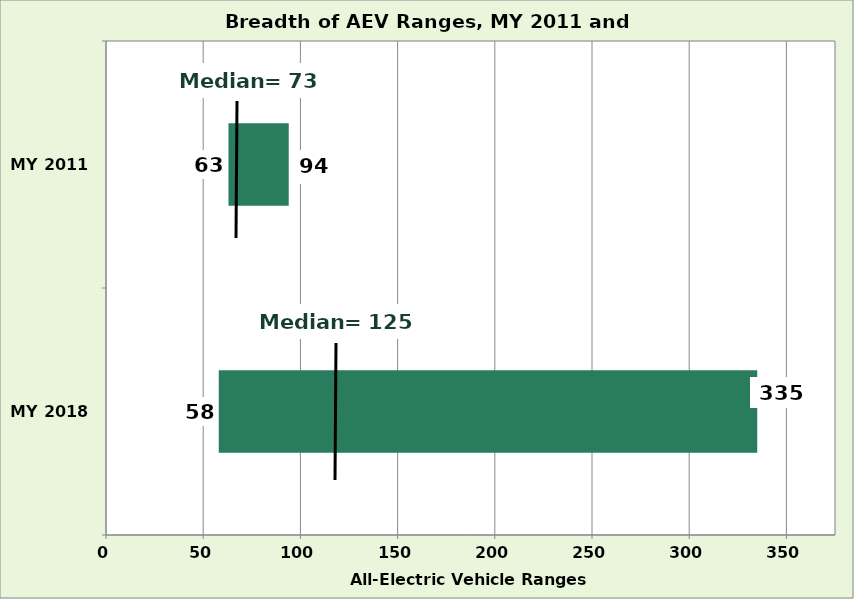
| Category | Series 0 | Series 1 |
|---|---|---|
| MY 2018 | 58 | 277 |
| MY 2011 | 63 | 31 |